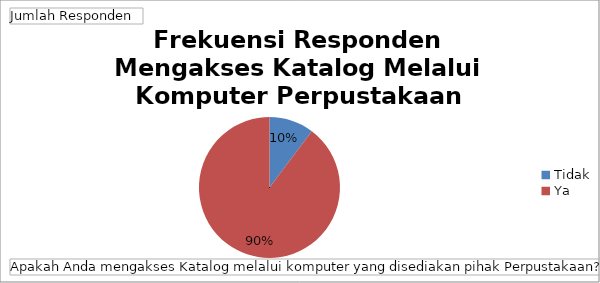
| Category | Total |
|---|---|
| Tidak | 8 |
| Ya | 70 |